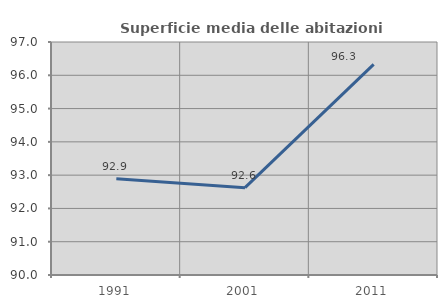
| Category | Superficie media delle abitazioni occupate |
|---|---|
| 1991.0 | 92.889 |
| 2001.0 | 92.624 |
| 2011.0 | 96.327 |